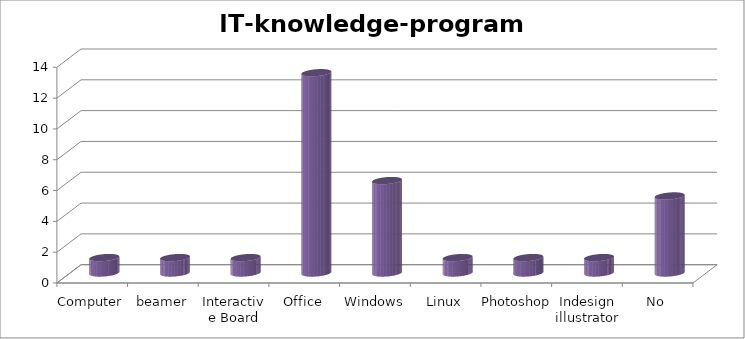
| Category | IT-knowledge-programms |
|---|---|
| Computer | 1 |
| beamer | 1 |
| Interactive Board | 1 |
| Office | 13 |
| Windows | 6 |
| Linux | 1 |
| Photoshop | 1 |
| Indesign illustrator | 1 |
| No | 5 |